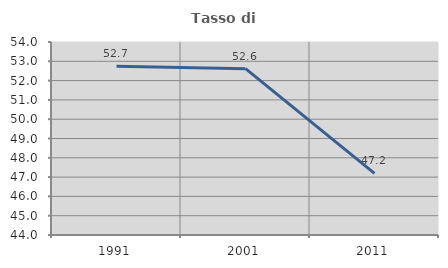
| Category | Tasso di occupazione   |
|---|---|
| 1991.0 | 52.738 |
| 2001.0 | 52.618 |
| 2011.0 | 47.197 |